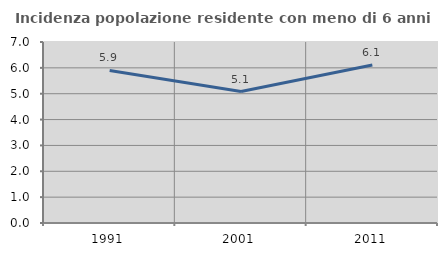
| Category | Incidenza popolazione residente con meno di 6 anni |
|---|---|
| 1991.0 | 5.9 |
| 2001.0 | 5.083 |
| 2011.0 | 6.114 |